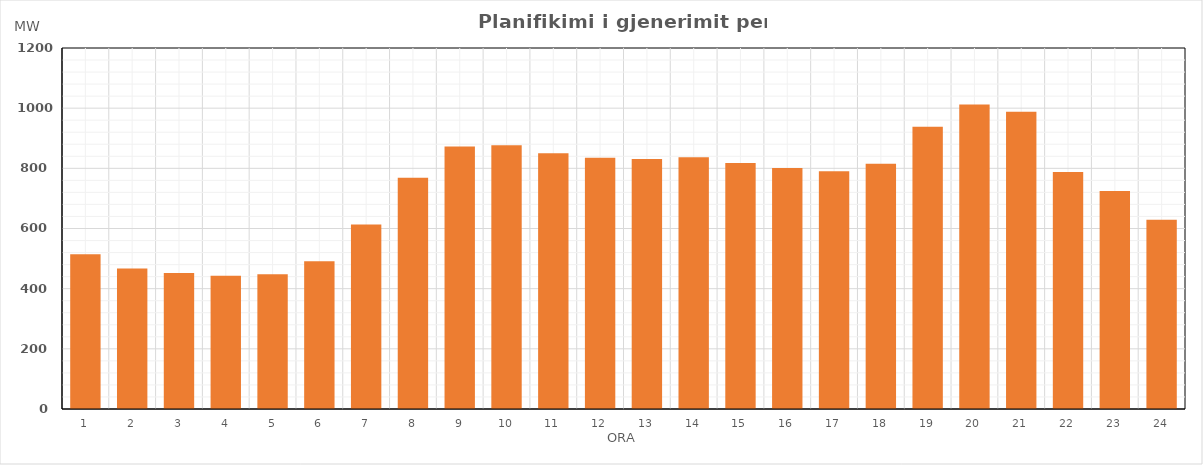
| Category | Max (MW) |
|---|---|
| 0 | 514.415 |
| 1 | 467.1 |
| 2 | 452.095 |
| 3 | 443.097 |
| 4 | 448.119 |
| 5 | 491.1 |
| 6 | 613.1 |
| 7 | 769.1 |
| 8 | 872.296 |
| 9 | 876.343 |
| 10 | 850.297 |
| 11 | 835.207 |
| 12 | 831.223 |
| 13 | 837.213 |
| 14 | 818.109 |
| 15 | 801.035 |
| 16 | 789.94 |
| 17 | 814.97 |
| 18 | 938.1 |
| 19 | 1012.503 |
| 20 | 988.417 |
| 21 | 787.995 |
| 22 | 724.673 |
| 23 | 629.117 |